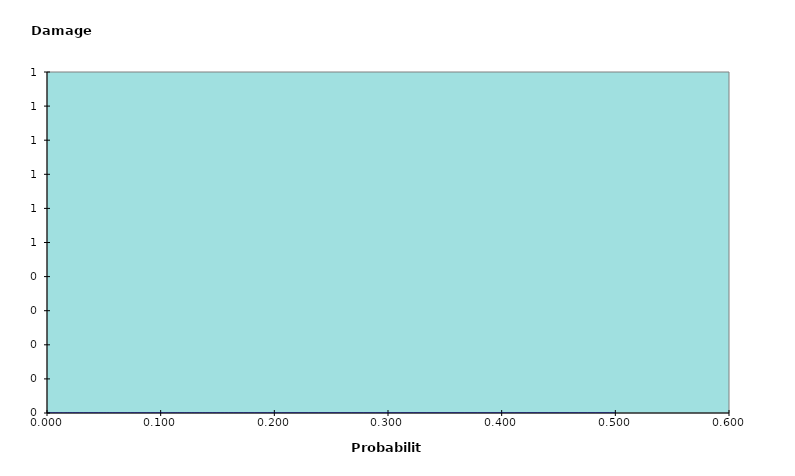
| Category | Damage |
|---|---|
| 0.5 | 0 |
| 0.2 | 0 |
| 0.1 | 0 |
| 0.05 | 0 |
| 0.02 | 0 |
| 0.013333333333333334 | 0 |
| 0.01 | 0 |
| 0.005 | 0 |
| 0.0 | 0 |